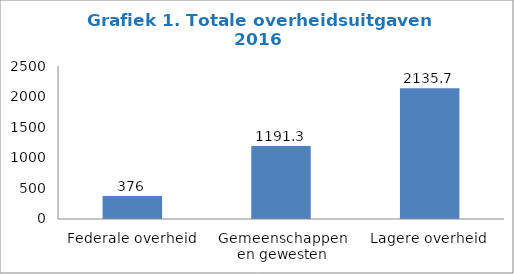
| Category | Series 0 |
|---|---|
| Federale overheid | 376 |
| Gemeenschappen en gewesten | 1191.3 |
| Lagere overheid | 2135.7 |